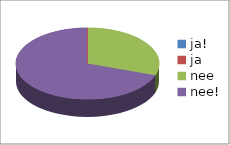
| Category | Series 0 | Series 1 |
|---|---|---|
| ja! | 0 | 0 |
| ja | 0 | 0 |
| nee | 10 | 0.303 |
| nee! | 23 | 0.697 |